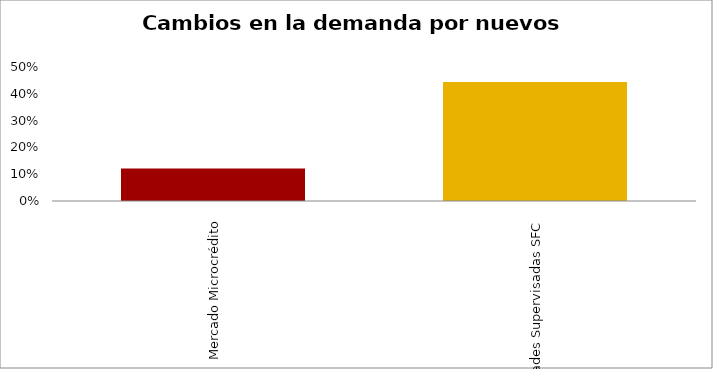
| Category | Microcrédito |
|---|---|
| Mercado Microcrédito | 0.121 |
| Entidades Supervisadas SFC | 0.444 |